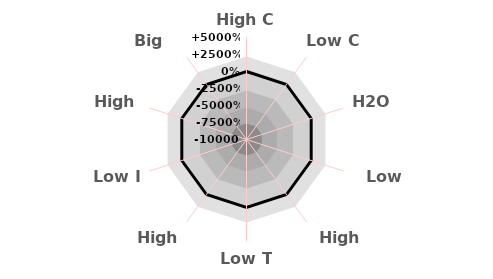
| Category | High C Low C H2O Low O2 High O2 Low T High T Low I High I Big Scale | Series 0 |
|---|---|---|
| High C | 37.5 | 0 |
| Low C | 37.5 | 0 |
| H2O | 37.5 | 0 |
| Low O2 | 37.5 | 0 |
| High O2 | 37.5 | 0 |
| Low T | 37.5 | 0 |
| High T | 37.5 | 0 |
| Low I | 37.5 | 0 |
| High I | 37.5 | 0 |
| Big Scale | 37.5 | 0 |